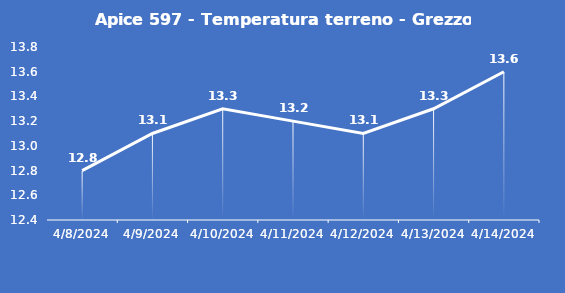
| Category | Apice 597 - Temperatura terreno - Grezzo (°C) |
|---|---|
| 4/8/24 | 12.8 |
| 4/9/24 | 13.1 |
| 4/10/24 | 13.3 |
| 4/11/24 | 13.2 |
| 4/12/24 | 13.1 |
| 4/13/24 | 13.3 |
| 4/14/24 | 13.6 |